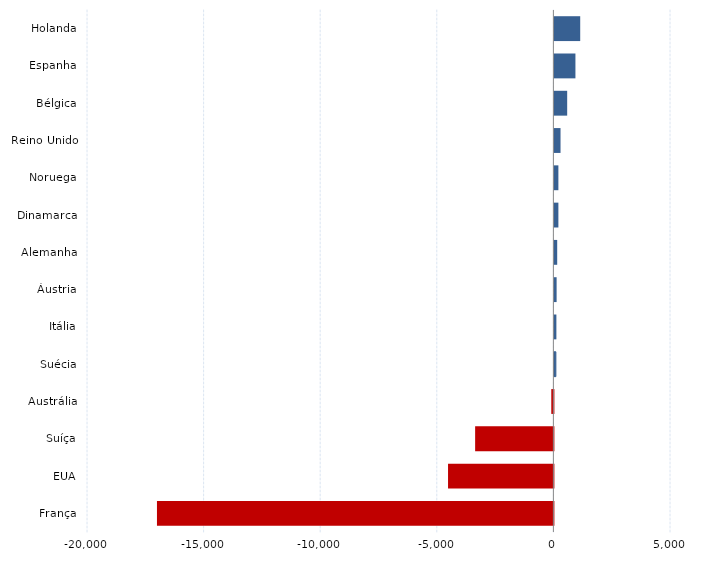
| Category | Series 0 |
|---|---|
| França | -17000 |
| EUA | -4518 |
| Suíça | -3356 |
| Austrália | -90 |
| Suécia | 63 |
| Itália | 85 |
| Áustria | 95 |
| Alemanha | 120 |
| Dinamarca | 171 |
| Noruega | 171 |
| Reino Unido | 263 |
| Bélgica | 548 |
| Espanha | 902 |
| Holanda | 1107 |